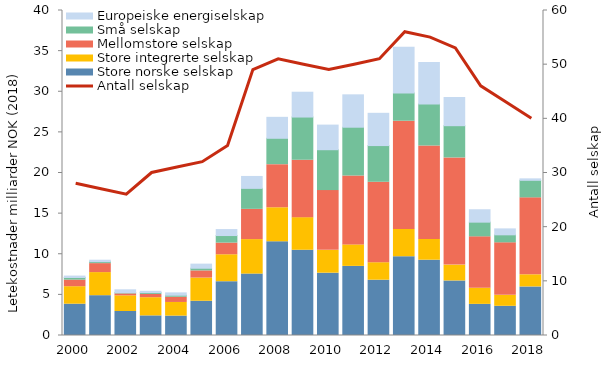
| Category | Store norske selskap | Store integrerte selskap | Mellomstore selskap | Små selskap | Europeiske energiselskap  |
|---|---|---|---|---|---|
| 2000.0 | 3.857 | 2.15 | 0.811 | 0.324 | 0.173 |
| 2001.0 | 4.902 | 2.841 | 1.104 | 0.24 | 0.179 |
| 2002.0 | 2.956 | 1.928 | 0.235 | 0.166 | 0.338 |
| 2003.0 | 2.414 | 2.24 | 0.393 | 0.228 | 0.162 |
| 2004.0 | 2.388 | 1.678 | 0.643 | 0.247 | 0.29 |
| 2005.0 | 4.216 | 2.853 | 0.883 | 0.327 | 0.505 |
| 2006.0 | 6.623 | 3.313 | 1.438 | 0.929 | 0.735 |
| 2007.0 | 7.563 | 4.241 | 3.723 | 2.582 | 1.466 |
| 2008.0 | 11.536 | 4.185 | 5.306 | 3.245 | 2.579 |
| 2009.0 | 10.492 | 4.012 | 7.074 | 5.309 | 3.054 |
| 2010.0 | 7.671 | 2.807 | 7.359 | 5.028 | 3.031 |
| 2011.0 | 8.507 | 2.644 | 8.47 | 6.014 | 3.985 |
| 2012.0 | 6.808 | 2.15 | 9.902 | 4.517 | 3.97 |
| 2013.0 | 9.696 | 3.363 | 13.313 | 3.481 | 5.619 |
| 2014.0 | 9.269 | 2.556 | 11.511 | 5.17 | 5.094 |
| 2015.0 | 6.715 | 1.948 | 13.19 | 3.969 | 3.467 |
| 2016.0 | 3.833 | 1.983 | 6.327 | 1.807 | 1.525 |
| 2017.0 | 3.595 | 1.344 | 6.467 | 0.983 | 0.73 |
| 2018.0 | 5.979 | 1.492 | 9.468 | 2.157 | 0.183 |